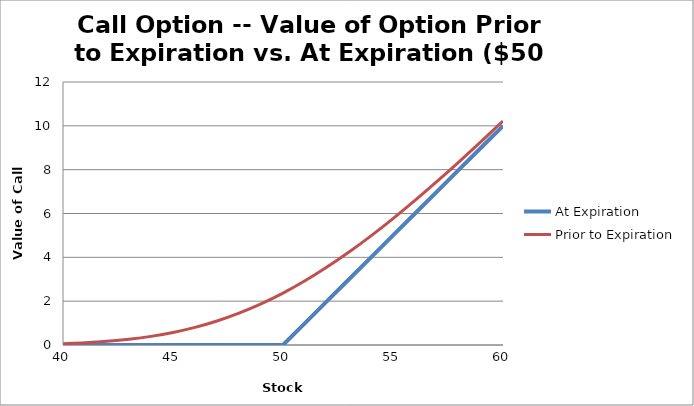
| Category | At Expiration |
|---|---|
| 40.0 | 0 |
| 41.0 | 0 |
| 42.0 | 0 |
| 43.0 | 0 |
| 44.0 | 0 |
| 45.0 | 0 |
| 46.0 | 0 |
| 47.0 | 0 |
| 48.0 | 0 |
| 49.0 | 0 |
| 50.0 | 0 |
| 51.0 | 1 |
| 52.0 | 2 |
| 53.0 | 3 |
| 54.0 | 4 |
| 55.0 | 5 |
| 56.0 | 6 |
| 57.0 | 7 |
| 58.0 | 8 |
| 59.0 | 9 |
| 60.0 | 10 |